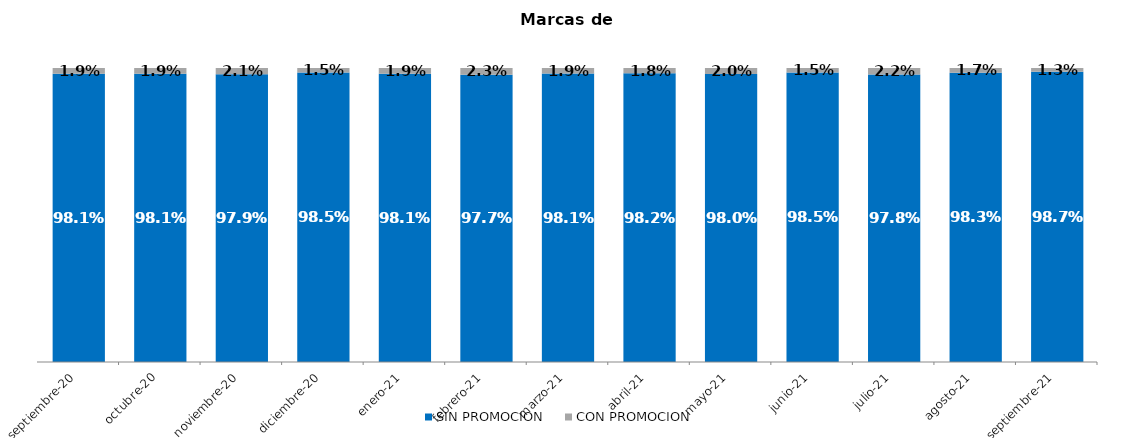
| Category | SIN PROMOCION   | CON PROMOCION   |
|---|---|---|
| 2020-09-01 | 0.981 | 0.019 |
| 2020-10-01 | 0.981 | 0.019 |
| 2020-11-01 | 0.979 | 0.021 |
| 2020-12-01 | 0.985 | 0.015 |
| 2021-01-01 | 0.981 | 0.019 |
| 2021-02-01 | 0.977 | 0.023 |
| 2021-03-01 | 0.981 | 0.019 |
| 2021-04-01 | 0.982 | 0.018 |
| 2021-05-01 | 0.98 | 0.02 |
| 2021-06-01 | 0.985 | 0.015 |
| 2021-07-01 | 0.978 | 0.022 |
| 2021-08-01 | 0.983 | 0.017 |
| 2021-09-01 | 0.987 | 0.013 |